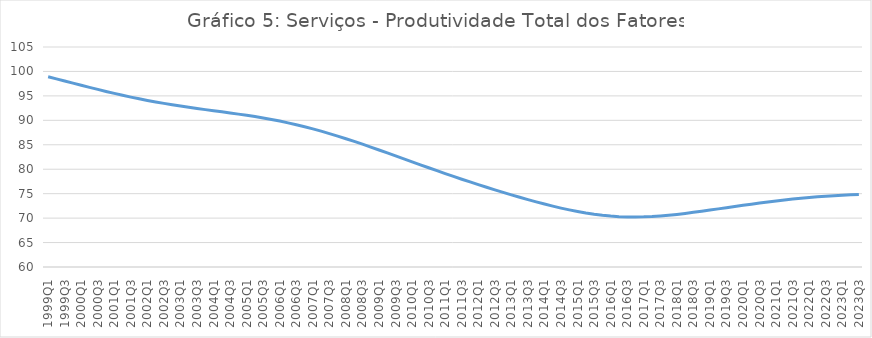
| Category | Series 0 |
|---|---|
| 1999Q1 | 98.917 |
| 1999Q2 | 98.481 |
| 1999Q3 | 98.045 |
| 1999Q4 | 97.61 |
| 2000Q1 | 97.176 |
| 2000Q2 | 96.746 |
| 2000Q3 | 96.323 |
| 2000Q4 | 95.909 |
| 2001Q1 | 95.507 |
| 2001Q2 | 95.121 |
| 2001Q3 | 94.753 |
| 2001Q4 | 94.404 |
| 2002Q1 | 94.074 |
| 2002Q2 | 93.763 |
| 2002Q3 | 93.467 |
| 2002Q4 | 93.186 |
| 2003Q1 | 92.919 |
| 2003Q2 | 92.665 |
| 2003Q3 | 92.423 |
| 2003Q4 | 92.189 |
| 2004Q1 | 91.962 |
| 2004Q2 | 91.736 |
| 2004Q3 | 91.507 |
| 2004Q4 | 91.272 |
| 2005Q1 | 91.025 |
| 2005Q2 | 90.763 |
| 2005Q3 | 90.48 |
| 2005Q4 | 90.175 |
| 2006Q1 | 89.844 |
| 2006Q2 | 89.486 |
| 2006Q3 | 89.101 |
| 2006Q4 | 88.689 |
| 2007Q1 | 88.249 |
| 2007Q2 | 87.783 |
| 2007Q3 | 87.292 |
| 2007Q4 | 86.778 |
| 2008Q1 | 86.243 |
| 2008Q2 | 85.689 |
| 2008Q3 | 85.118 |
| 2008Q4 | 84.533 |
| 2009Q1 | 83.937 |
| 2009Q2 | 83.333 |
| 2009Q3 | 82.725 |
| 2009Q4 | 82.114 |
| 2010Q1 | 81.504 |
| 2010Q2 | 80.897 |
| 2010Q3 | 80.294 |
| 2010Q4 | 79.698 |
| 2011Q1 | 79.109 |
| 2011Q2 | 78.529 |
| 2011Q3 | 77.958 |
| 2011Q4 | 77.398 |
| 2012Q1 | 76.848 |
| 2012Q2 | 76.31 |
| 2012Q3 | 75.783 |
| 2012Q4 | 75.266 |
| 2013Q1 | 74.76 |
| 2013Q2 | 74.265 |
| 2013Q3 | 73.785 |
| 2013Q4 | 73.32 |
| 2014Q1 | 72.873 |
| 2014Q2 | 72.448 |
| 2014Q3 | 72.049 |
| 2014Q4 | 71.679 |
| 2015Q1 | 71.342 |
| 2015Q2 | 71.042 |
| 2015Q3 | 70.785 |
| 2015Q4 | 70.574 |
| 2016Q1 | 70.412 |
| 2016Q2 | 70.3 |
| 2016Q3 | 70.237 |
| 2016Q4 | 70.223 |
| 2017Q1 | 70.254 |
| 2017Q2 | 70.329 |
| 2017Q3 | 70.441 |
| 2017Q4 | 70.587 |
| 2018Q1 | 70.762 |
| 2018Q2 | 70.959 |
| 2018Q3 | 71.176 |
| 2018Q4 | 71.406 |
| 2019Q1 | 71.645 |
| 2019Q2 | 71.889 |
| 2019Q3 | 72.135 |
| 2019Q4 | 72.379 |
| 2020Q1 | 72.619 |
| 2020Q2 | 72.854 |
| 2020Q3 | 73.083 |
| 2020Q4 | 73.302 |
| 2021Q1 | 73.51 |
| 2021Q2 | 73.705 |
| 2021Q3 | 73.888 |
| 2021Q4 | 74.057 |
| 2022Q1 | 74.212 |
| 2022Q2 | 74.353 |
| 2022Q3 | 74.479 |
| 2022Q4 | 74.59 |
| 2023Q1 | 74.684 |
| 2023Q2 | 74.764 |
| 2023Q3 | 74.829 |